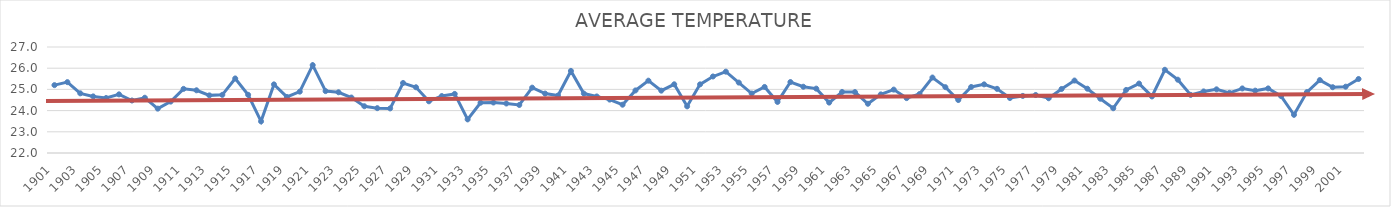
| Category | AVERAGE TEMPERATURE |
|---|---|
| 1901.0 | 25.202 |
| 1902.0 | 25.342 |
| 1903.0 | 24.814 |
| 1904.0 | 24.669 |
| 1905.0 | 24.593 |
| 1906.0 | 24.766 |
| 1907.0 | 24.476 |
| 1908.0 | 24.606 |
| 1909.0 | 24.092 |
| 1910.0 | 24.424 |
| 1911.0 | 25.024 |
| 1912.0 | 24.958 |
| 1913.0 | 24.718 |
| 1914.0 | 24.744 |
| 1915.0 | 25.516 |
| 1916.0 | 24.744 |
| 1917.0 | 23.492 |
| 1918.0 | 25.237 |
| 1919.0 | 24.645 |
| 1920.0 | 24.894 |
| 1921.0 | 26.145 |
| 1922.0 | 24.92 |
| 1923.0 | 24.865 |
| 1924.0 | 24.615 |
| 1925.0 | 24.206 |
| 1926.0 | 24.115 |
| 1927.0 | 24.104 |
| 1928.0 | 25.302 |
| 1929.0 | 25.1 |
| 1930.0 | 24.439 |
| 1931.0 | 24.687 |
| 1932.0 | 24.786 |
| 1933.0 | 23.586 |
| 1934.0 | 24.372 |
| 1935.0 | 24.382 |
| 1936.0 | 24.335 |
| 1937.0 | 24.266 |
| 1938.0 | 25.082 |
| 1939.0 | 24.802 |
| 1940.0 | 24.711 |
| 1941.0 | 25.871 |
| 1942.0 | 24.802 |
| 1943.0 | 24.667 |
| 1944.0 | 24.52 |
| 1945.0 | 24.278 |
| 1946.0 | 24.951 |
| 1947.0 | 25.412 |
| 1948.0 | 24.941 |
| 1949.0 | 25.24 |
| 1950.0 | 24.201 |
| 1951.0 | 25.238 |
| 1952.0 | 25.609 |
| 1953.0 | 25.836 |
| 1954.0 | 25.322 |
| 1955.0 | 24.806 |
| 1956.0 | 25.115 |
| 1957.0 | 24.41 |
| 1958.0 | 25.347 |
| 1959.0 | 25.125 |
| 1960.0 | 25.036 |
| 1961.0 | 24.378 |
| 1962.0 | 24.879 |
| 1963.0 | 24.873 |
| 1964.0 | 24.322 |
| 1965.0 | 24.764 |
| 1966.0 | 24.99 |
| 1967.0 | 24.59 |
| 1968.0 | 24.781 |
| 1969.0 | 25.56 |
| 1970.0 | 25.105 |
| 1971.0 | 24.499 |
| 1972.0 | 25.115 |
| 1973.0 | 25.238 |
| 1974.0 | 25.027 |
| 1975.0 | 24.595 |
| 1976.0 | 24.693 |
| 1977.0 | 24.736 |
| 1978.0 | 24.583 |
| 1979.0 | 25.02 |
| 1980.0 | 25.417 |
| 1981.0 | 25.032 |
| 1982.0 | 24.561 |
| 1983.0 | 24.111 |
| 1984.0 | 24.974 |
| 1985.0 | 25.275 |
| 1986.0 | 24.668 |
| 1987.0 | 25.925 |
| 1988.0 | 25.458 |
| 1989.0 | 24.742 |
| 1990.0 | 24.904 |
| 1991.0 | 25.003 |
| 1992.0 | 24.837 |
| 1993.0 | 25.046 |
| 1994.0 | 24.941 |
| 1995.0 | 25.046 |
| 1996.0 | 24.686 |
| 1997.0 | 23.802 |
| 1998.0 | 24.873 |
| 1999.0 | 25.439 |
| 2000.0 | 25.103 |
| 2001.0 | 25.127 |
| 2002.0 | 25.491 |